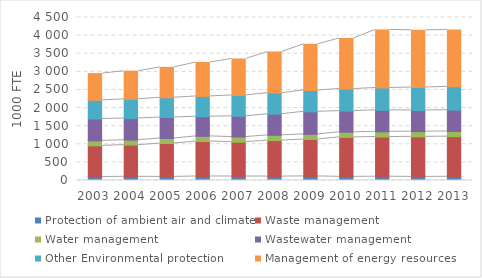
| Category | Protection of ambient air and climate | Waste management | Water management | Wastewater management | Other Environmental protection | Management of energy resources |
|---|---|---|---|---|---|---|
| 2003.0 | 97 | 860 | 137 | 604 | 514 | 739 |
| 2004.0 | 102 | 874 | 137 | 599 | 531 | 775 |
| 2005.0 | 100 | 920 | 140 | 579 | 545 | 839 |
| 2006.0 | 111 | 966 | 141 | 543 | 560 | 936 |
| 2007.0 | 110 | 949 | 140 | 573 | 577 | 1006 |
| 2008.0 | 108 | 994 | 145 | 584 | 581 | 1136 |
| 2009.0 | 113 | 1019 | 141 | 623 | 590 | 1274 |
| 2010.0 | 101 | 1090 | 141 | 584 | 609 | 1396 |
| 2011.0 | 105 | 1095 | 144 | 594 | 616 | 1603 |
| 2012.0 | 99 | 1107 | 143 | 584 | 635 | 1580 |
| 2013.0 | 103 | 1108 | 143 | 589 | 643 | 1569 |